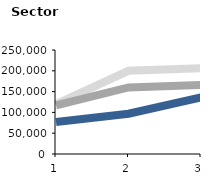
| Category | Needs | Target | Coverage |
|---|---|---|---|
| 0 | 120000 | 117000 | 77000 |
| 1900-01-01 | 200000 | 160000 | 96900 |
| 1900-01-02 | 206000 | 166164 | 136244 |